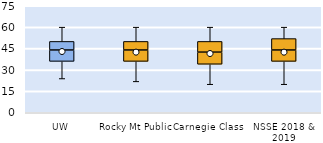
| Category | 25th | 50th | 75th |
|---|---|---|---|
| UW | 36 | 8 | 6 |
| Rocky Mt Public | 36 | 8 | 6 |
| Carnegie Class | 34 | 8.5 | 7.5 |
| NSSE 2018 & 2019 | 36 | 8 | 8 |